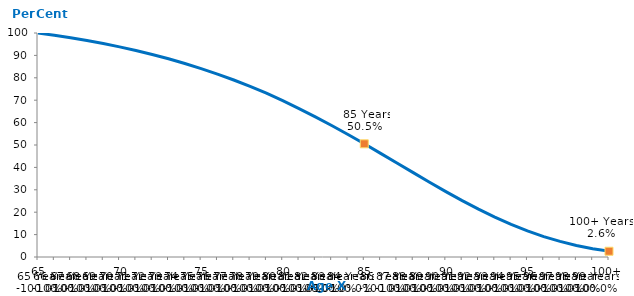
| Category | Male aged 65 years in 2019 |
|---|---|
|  65 | 100 |
|  66 | 98.965 |
|  67 | 97.853 |
|  68 | 96.643 |
|  69 | 95.303 |
|  70 | 93.818 |
|  71 | 92.188 |
|  72 | 90.415 |
|  73 | 88.486 |
|  74 | 86.378 |
|  75 | 84.089 |
|  76 | 81.632 |
|  77 | 79.012 |
|  78 | 76.195 |
|  79 | 73.132 |
|  80 | 69.815 |
|  81 | 66.281 |
|  82 | 62.573 |
|  83 | 58.71 |
|  84 | 54.693 |
|  85 | 50.534 |
|  86 | 46.279 |
|  87 | 41.969 |
|  88 | 37.652 |
|  89 | 33.377 |
|  90 | 29.201 |
|  91 | 25.179 |
|  92 | 21.368 |
|  93 | 17.816 |
|  94 | 14.571 |
|  95 | 11.665 |
|  96 | 9.123 |
|  97 | 6.954 |
|  98 | 5.151 |
|  99 | 3.699 |
| 100+ | 2.567 |